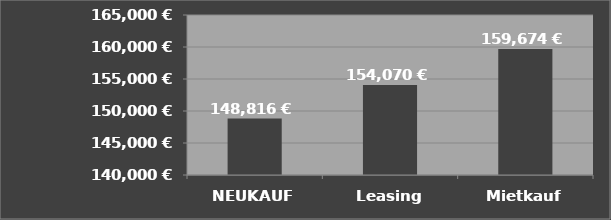
| Category | Summe mit
Zinsen + Gebühren |
|---|---|
| NEUKAUF | 148816 |
| Leasing | 154070.217 |
| Mietkauf | 159674.492 |